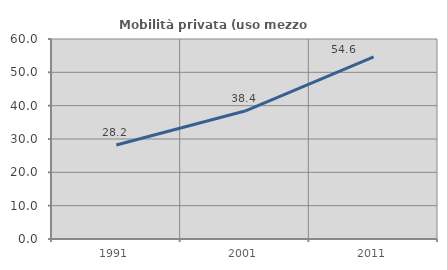
| Category | Mobilità privata (uso mezzo privato) |
|---|---|
| 1991.0 | 28.209 |
| 2001.0 | 38.39 |
| 2011.0 | 54.61 |